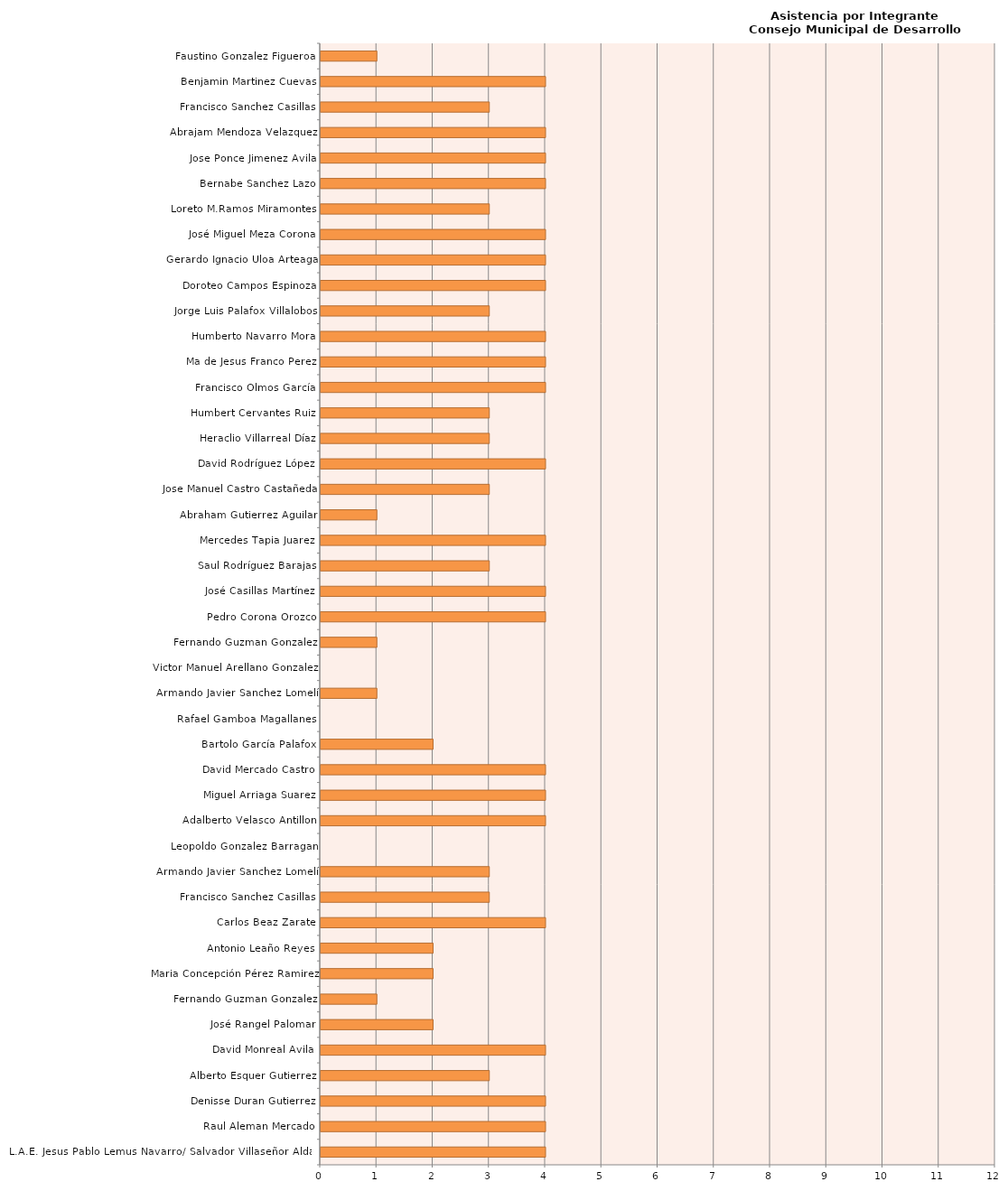
| Category | Series 0 |
|---|---|
| L.A.E. Jesus Pablo Lemus Navarro/ Salvador Villaseñor Aldama | 4 |
| Raul Aleman Mercado | 4 |
| Denisse Duran Gutierrez | 4 |
| Alberto Esquer Gutierrez | 3 |
| David Monreal Avila | 4 |
| José Rangel Palomar | 2 |
| Fernando Guzman Gonzalez | 1 |
| Maria Concepción Pérez Ramirez | 2 |
| Antonio Leaño Reyes | 2 |
| Carlos Beaz Zarate | 4 |
| Francisco Sanchez Casillas | 3 |
| Armando Javier Sanchez Lomelí | 3 |
| Leopoldo Gonzalez Barragan | 0 |
| Adalberto Velasco Antillon | 4 |
| Miguel Arriaga Suarez | 4 |
| David Mercado Castro | 4 |
| Bartolo García Palafox | 2 |
| Rafael Gamboa Magallanes | 0 |
| Armando Javier Sanchez Lomelí | 1 |
| Victor Manuel Arellano Gonzalez | 0 |
| Fernando Guzman Gonzalez | 1 |
| Pedro Corona Orozco | 4 |
| José Casillas Martínez | 4 |
| Saul Rodríguez Barajas | 3 |
| Mercedes Tapia Juarez | 4 |
| Abraham Gutierrez Aguilar | 1 |
| Jose Manuel Castro Castañeda | 3 |
| David Rodríguez López | 4 |
| Heraclio Villarreal Díaz | 3 |
| Humbert Cervantes Ruiz | 3 |
| Francisco Olmos García | 4 |
| Ma de Jesus Franco Perez | 4 |
| Humberto Navarro Mora | 4 |
| Jorge Luis Palafox Villalobos | 3 |
| Doroteo Campos Espinoza | 4 |
| Gerardo Ignacio Uloa Arteaga | 4 |
| José Miguel Meza Corona | 4 |
| Loreto M.Ramos Miramontes | 3 |
| Bernabe Sanchez Lazo | 4 |
| Jose Ponce Jimenez Avila | 4 |
| Abrajam Mendoza Velazquez | 4 |
| Francisco Sanchez Casillas | 3 |
| Benjamin Martinez Cuevas | 4 |
| Faustino Gonzalez Figueroa | 1 |